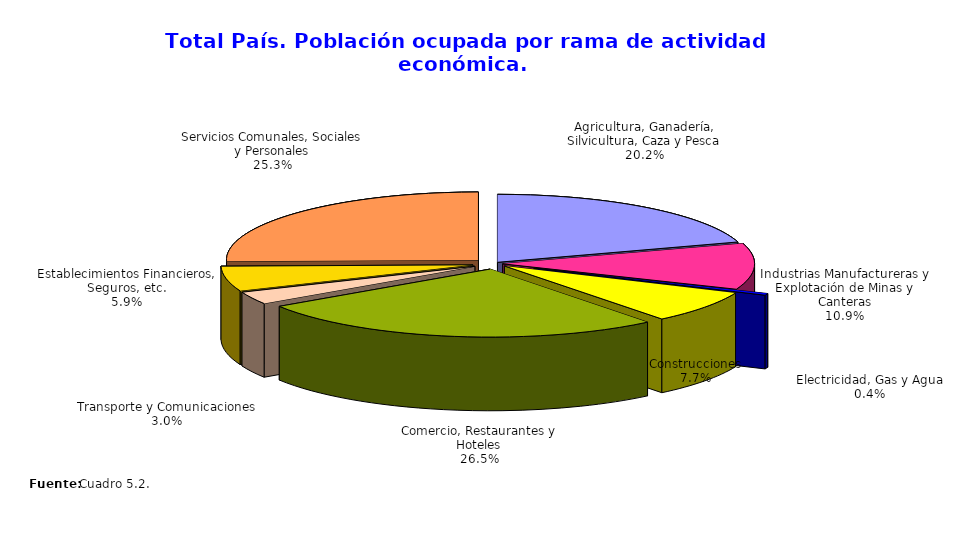
| Category | Series 0 |
|---|---|
| Agricultura, Ganadería, Silvicultura, Caza y Pesca | 700872 |
| Industrias Manufactureras y Explotación de Minas y Canteras | 379933 |
| Electricidad, Gas y Agua | 14811 |
| Construcciones | 268968 |
| Comercio, Restaurantes y Hoteles | 921775 |
| Transporte y Comunicaciones | 104190 |
| Establecimientos Financieros, Seguros, etc. | 205984 |
| Servicios Comunales, Sociales y Personales | 879626 |